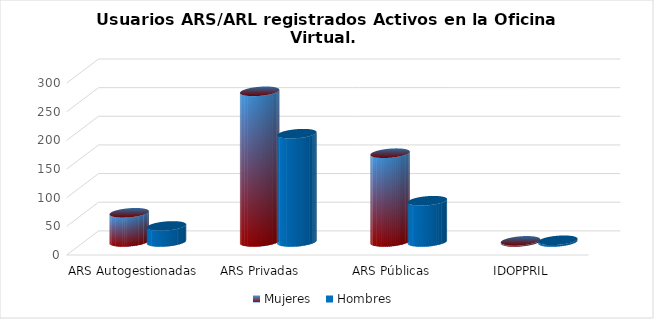
| Category | Mujeres | Hombres |
|---|---|---|
| ARS Autogestionadas | 51 | 28 |
| ARS Privadas | 263 | 189 |
| ARS Públicas | 155 | 72 |
| IDOPPRIL | 2 | 3 |